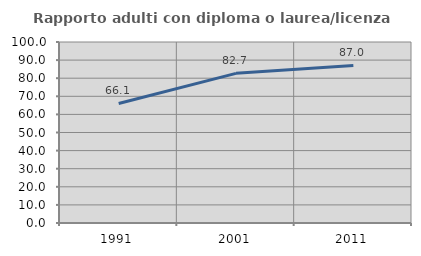
| Category | Rapporto adulti con diploma o laurea/licenza media  |
|---|---|
| 1991.0 | 66.052 |
| 2001.0 | 82.672 |
| 2011.0 | 87.018 |